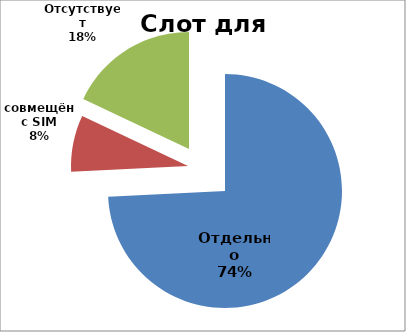
| Category | Series 0 |
|---|---|
| Отдельно | 95 |
| совмещён с SIM | 10 |
| Отсутствует | 23 |